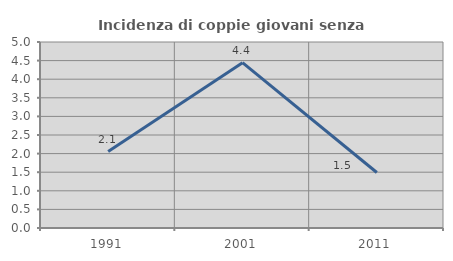
| Category | Incidenza di coppie giovani senza figli |
|---|---|
| 1991.0 | 2.055 |
| 2001.0 | 4.444 |
| 2011.0 | 1.493 |